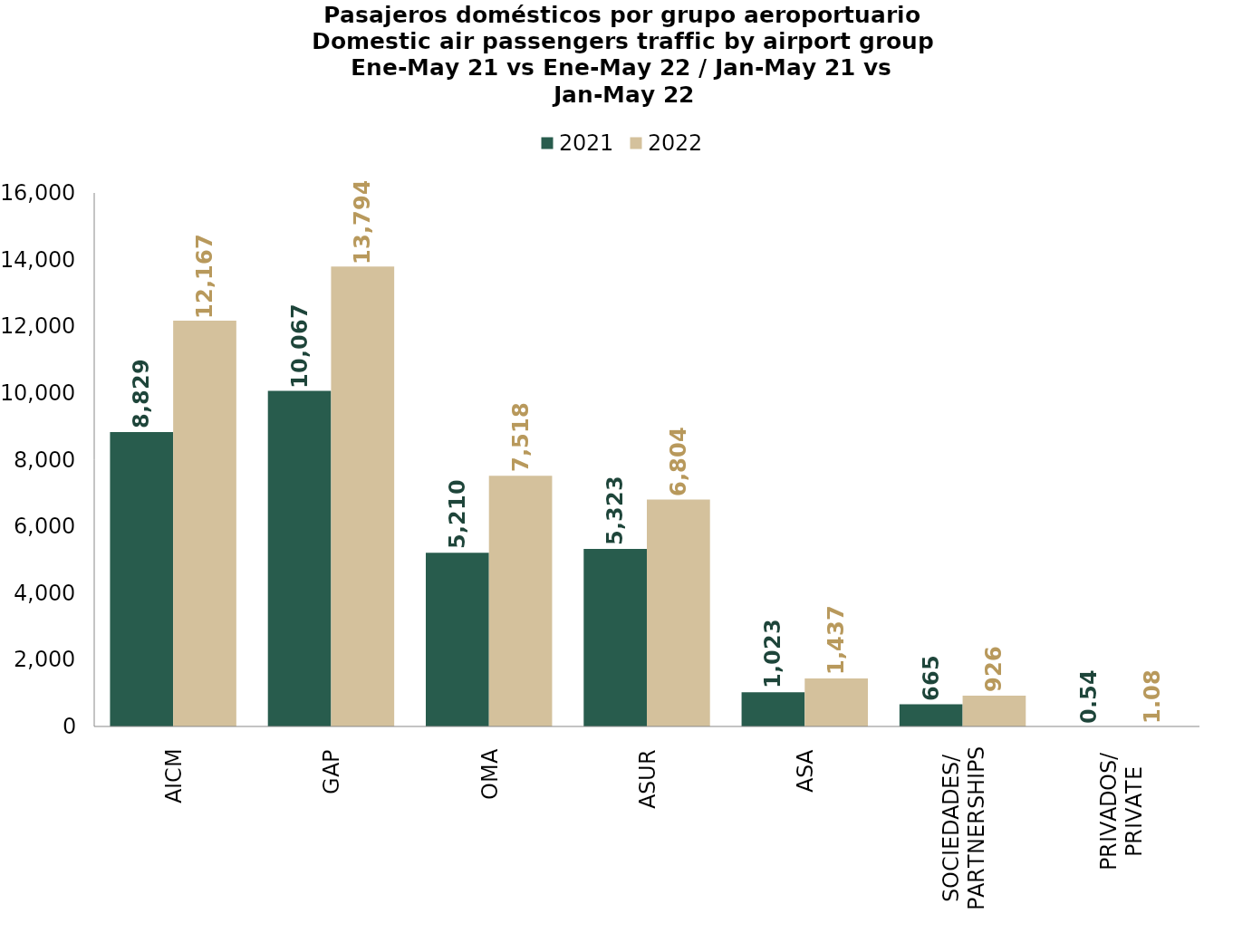
| Category | 2021 | 2022 |
|---|---|---|
| AICM | 8829.446 | 12167.056 |
| GAP | 10066.532 | 13794.259 |
| OMA | 5210.131 | 7517.509 |
| ASUR | 5322.611 | 6803.911 |
| ASA | 1023.346 | 1436.942 |
| SOCIEDADES/
PARTNERSHIPS | 664.969 | 925.962 |
| PRIVADOS/
PRIVATE | 0.538 | 1.075 |